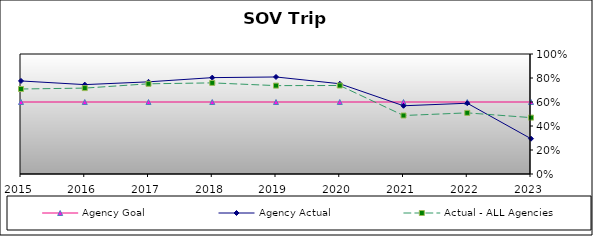
| Category | Agency Goal | Agency Actual | Actual - ALL Agencies |
|---|---|---|---|
| 2015.0 | 0.6 | 0.776 | 0.708 |
| 2016.0 | 0.6 | 0.745 | 0.716 |
| 2017.0 | 0.6 | 0.768 | 0.752 |
| 2018.0 | 0.6 | 0.803 | 0.759 |
| 2019.0 | 0.6 | 0.808 | 0.736 |
| 2020.0 | 0.6 | 0.752 | 0.737 |
| 2021.0 | 0.6 | 0.569 | 0.487 |
| 2022.0 | 0.6 | 0.59 | 0.509 |
| 2023.0 | 0.6 | 0.294 | 0.47 |